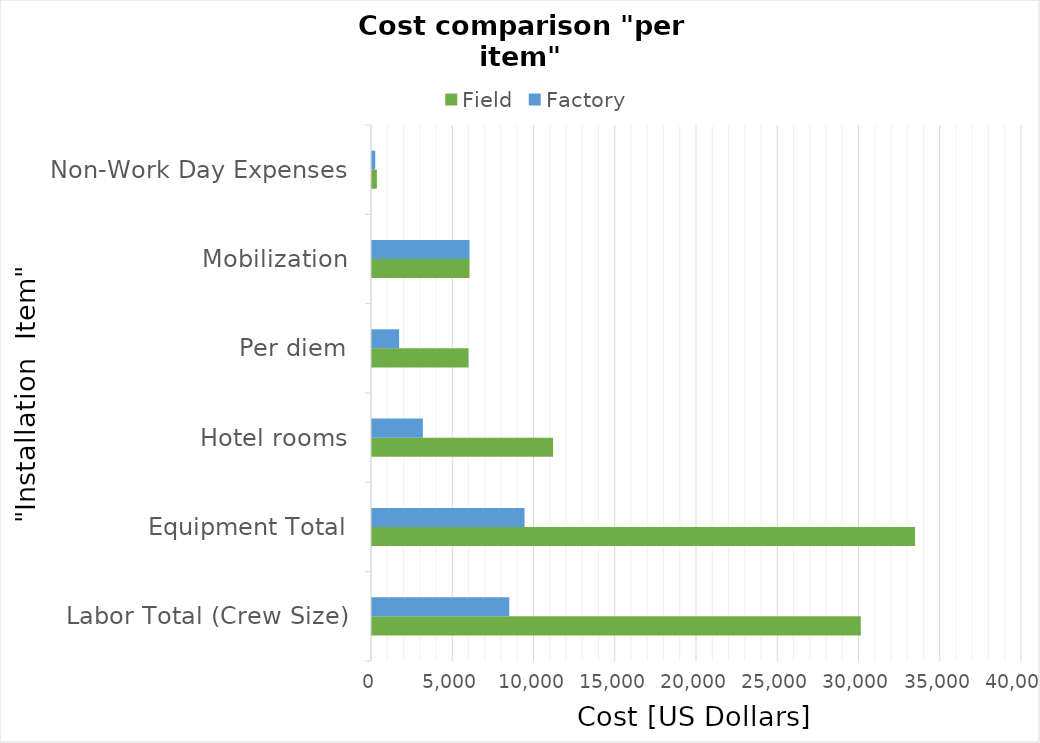
| Category | Field | Factory |
|---|---|---|
| Labor Total (Crew Size) | 30078.571 | 8448.75 |
| Equipment Total | 33420.635 | 9387.5 |
| Hotel rooms | 11140.212 | 3129.167 |
| Per diem | 5941.446 | 1668.889 |
| Mobilization | 6000 | 6000 |
| Non-Work Day Expenses | 300 | 200 |